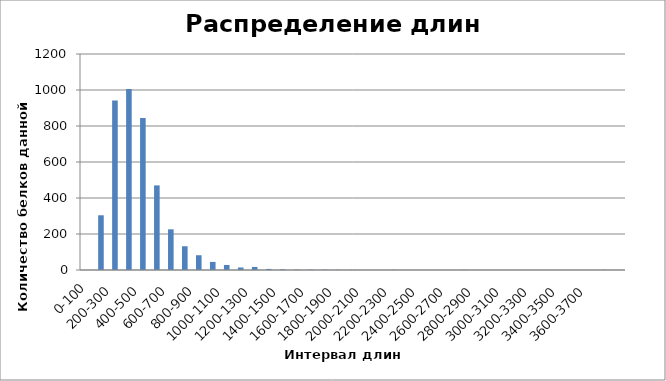
| Category | Частота |
|---|---|
| 0-100 | 0 |
| 100-200 | 304 |
| 200-300 | 942 |
| 300-400 | 1006 |
| 400-500 | 844 |
| 500-600 | 470 |
| 600-700 | 226 |
| 700-800 | 132 |
| 800-900 | 82 |
| 900-1000 | 45 |
| 1000-1100 | 28 |
| 1100-1200 | 14 |
| 1200-1300 | 17 |
| 1300-1400 | 6 |
| 1400-1500 | 4 |
| 1500-1600 | 2 |
| 1600-1700 | 2 |
| 1700-1800 | 2 |
| 1800-1900 | 1 |
| 1900-2000 | 1 |
| 2000-2100 | 0 |
| 2100-2200 | 0 |
| 2200-2300 | 1 |
| 2300-2400 | 0 |
| 2400-2500 | 0 |
| 2500-2600 | 0 |
| 2600-2700 | 0 |
| 2700-2800 | 1 |
| 2800-2900 | 0 |
| 2900-3000 | 0 |
| 3000-3100 | 0 |
| 3100-3200 | 0 |
| 3200-3300 | 0 |
| 3300-3400 | 0 |
| 3400-3500 | 0 |
| 3500-3600 | 0 |
| 3600-3700 | 0 |
| 3700-Еще | 1 |